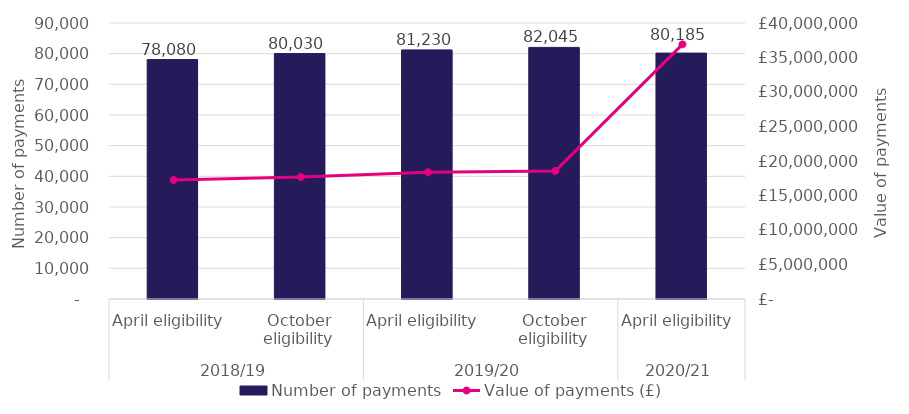
| Category | Number of payments |
|---|---|
| 0 | 78080 |
| 1 | 80030 |
| 2 | 81230 |
| 3 | 82045 |
| 4 | 80185 |